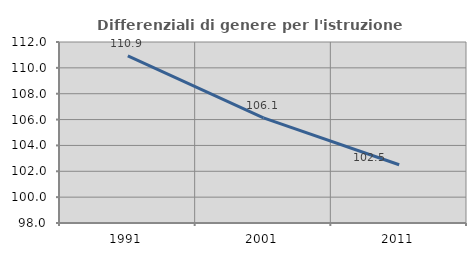
| Category | Differenziali di genere per l'istruzione superiore |
|---|---|
| 1991.0 | 110.929 |
| 2001.0 | 106.125 |
| 2011.0 | 102.509 |